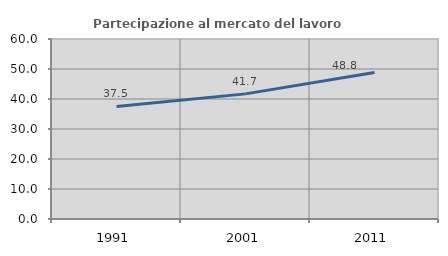
| Category | Partecipazione al mercato del lavoro  femminile |
|---|---|
| 1991.0 | 37.518 |
| 2001.0 | 41.709 |
| 2011.0 | 48.832 |